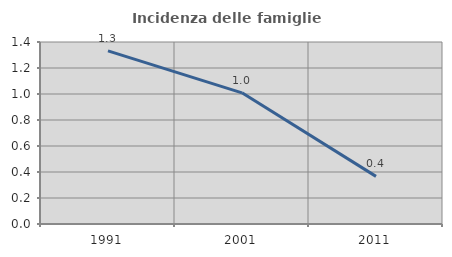
| Category | Incidenza delle famiglie numerose |
|---|---|
| 1991.0 | 1.332 |
| 2001.0 | 1.009 |
| 2011.0 | 0.366 |